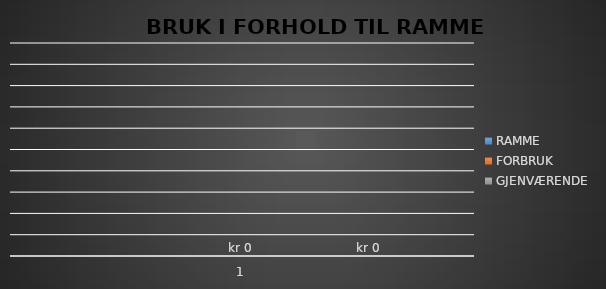
| Category | RAMME | FORBRUK | GJENVÆRENDE |
|---|---|---|---|
| 0 |  | 0 | 0 |